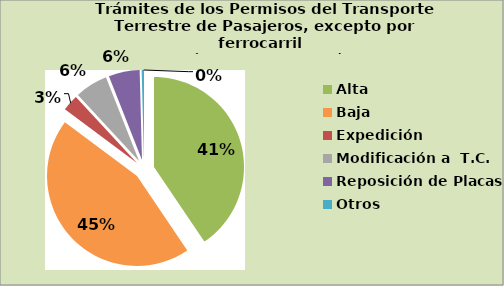
| Category | Series 0 |
|---|---|
| Alta                                         | 40.552 |
| Baja | 44.657 |
| Expedición | 2.91 |
| Modificación a  T.C. | 5.896 |
| Reposición de Placas | 5.567 |
| Otros | 0.418 |